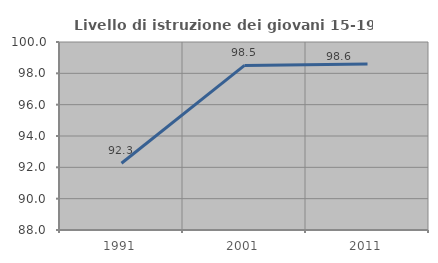
| Category | Livello di istruzione dei giovani 15-19 anni |
|---|---|
| 1991.0 | 92.258 |
| 2001.0 | 98.507 |
| 2011.0 | 98.601 |